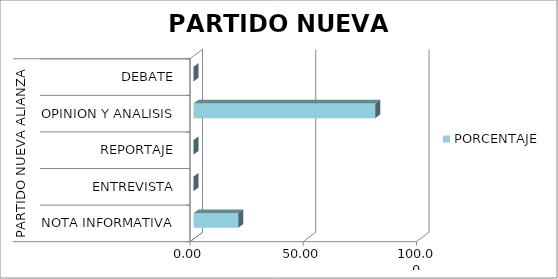
| Category | PORCENTAJE |
|---|---|
| 0 | 19.718 |
| 1 | 0 |
| 2 | 0 |
| 3 | 80.282 |
| 4 | 0 |